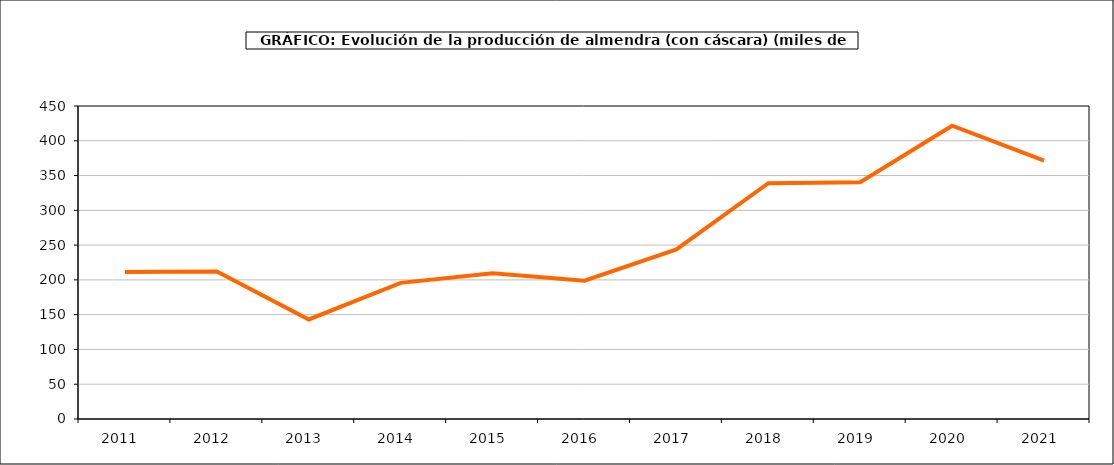
| Category | producción almendro |
|---|---|
| 2011.0 | 211.179 |
| 2012.0 | 212.063 |
| 2013.0 | 143.081 |
| 2014.0 | 195.699 |
| 2015.0 | 209.443 |
| 2016.0 | 198.767 |
| 2017.0 | 243.876 |
| 2018.0 | 339.033 |
| 2019.0 | 340.421 |
| 2020.0 | 421.61 |
| 2021.0 | 371.46 |